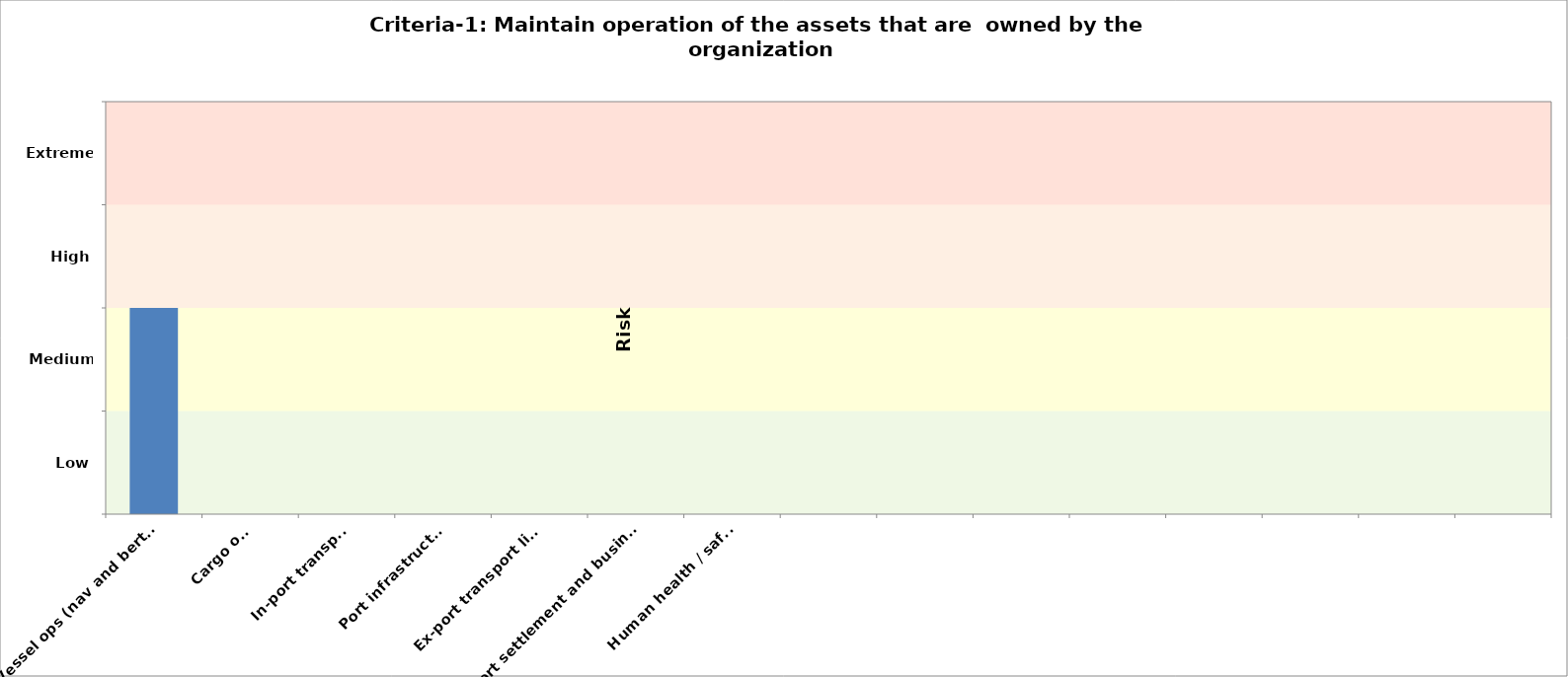
| Category | Criteria-2 (Community asset) | Criteria-1 2050 |
|---|---|---|
| Vessel ops (nav and berthing) |  | 2 |
| Cargo ops |  | 0 |
| In-port transport |  | 0 |
| Port infrastructure |  | 0 |
| Ex-port transport links |  | 0 |
| Ex-port settlement and businesses |  | 0 |
| Human health / safety  |  | 0 |